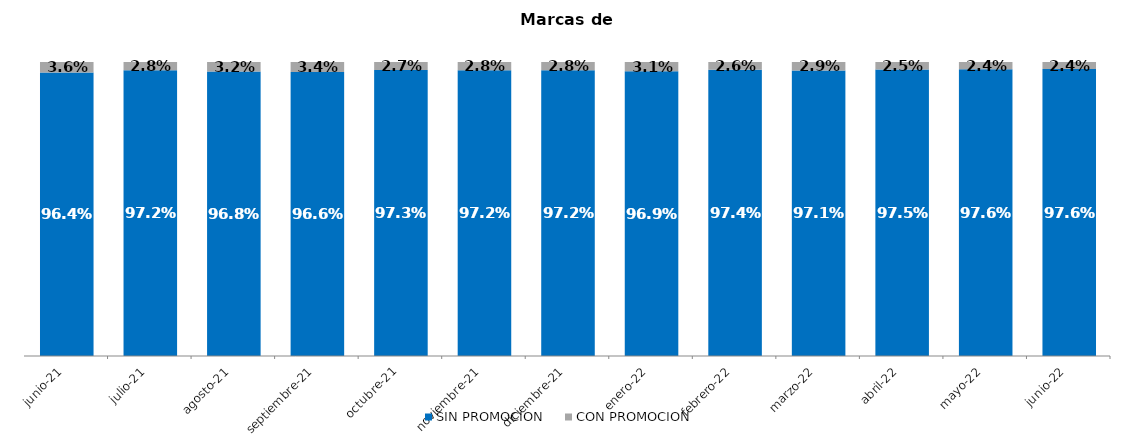
| Category | SIN PROMOCION   | CON PROMOCION   |
|---|---|---|
| 2021-06-01 | 0.964 | 0.036 |
| 2021-07-01 | 0.972 | 0.028 |
| 2021-08-01 | 0.968 | 0.032 |
| 2021-09-01 | 0.966 | 0.034 |
| 2021-10-01 | 0.973 | 0.027 |
| 2021-11-01 | 0.972 | 0.028 |
| 2021-12-01 | 0.972 | 0.028 |
| 2022-01-01 | 0.969 | 0.031 |
| 2022-02-01 | 0.974 | 0.026 |
| 2022-03-01 | 0.971 | 0.029 |
| 2022-04-01 | 0.975 | 0.025 |
| 2022-05-01 | 0.976 | 0.024 |
| 2022-06-01 | 0.976 | 0.024 |